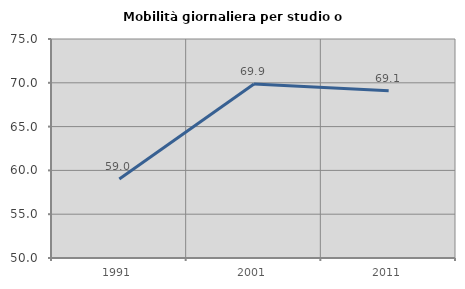
| Category | Mobilità giornaliera per studio o lavoro |
|---|---|
| 1991.0 | 59.027 |
| 2001.0 | 69.87 |
| 2011.0 | 69.089 |